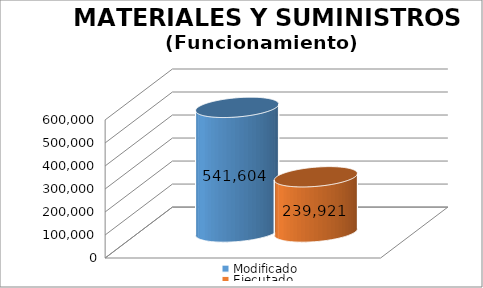
| Category | Modificado | Ejecutado |
|---|---|---|
| 0 | 541604 | 239920.78 |